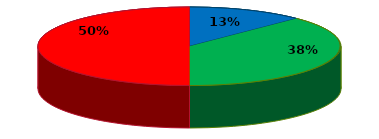
| Category | Series 0 |
|---|---|
| 0 | 0.25 |
| 1 | 0.75 |
| 2 | 1 |